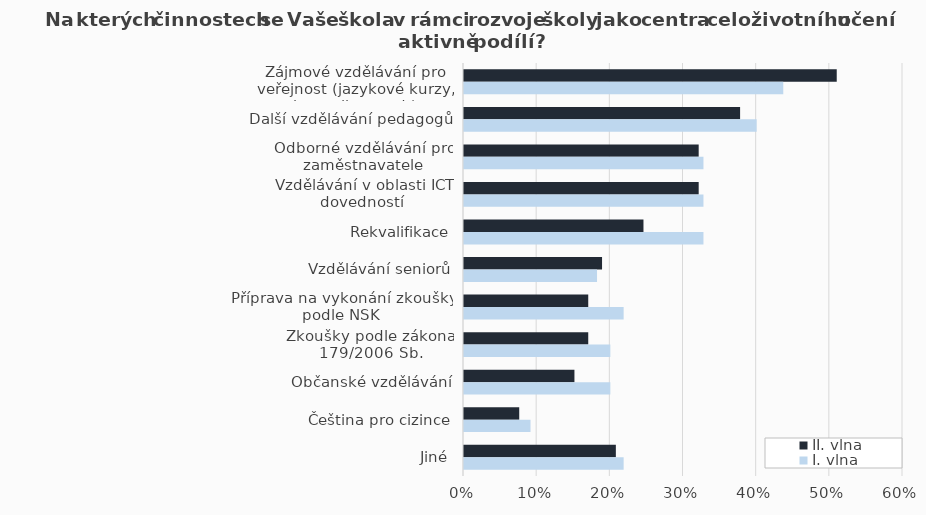
| Category | II. vlna | I. vlna |
|---|---|---|
| Zájmové vzdělávání pro veřejnost (jazykové kurzy, keramika apod.) | 0.509 | 0.436 |
| Další vzdělávání pedagogů | 0.377 | 0.4 |
| Odborné vzdělávání pro zaměstnavatele | 0.321 | 0.327 |
| Vzdělávání v oblasti ICT dovedností  | 0.321 | 0.327 |
| Rekvalifikace | 0.245 | 0.327 |
| Vzdělávání seniorů | 0.189 | 0.182 |
| Příprava na vykonání zkoušky podle NSK | 0.17 | 0.218 |
| Zkoušky podle zákona 179/2006 Sb. | 0.17 | 0.2 |
| Občanské vzdělávání | 0.151 | 0.2 |
| Čeština pro cizince | 0.075 | 0.091 |
| Jiné | 0.208 | 0.218 |